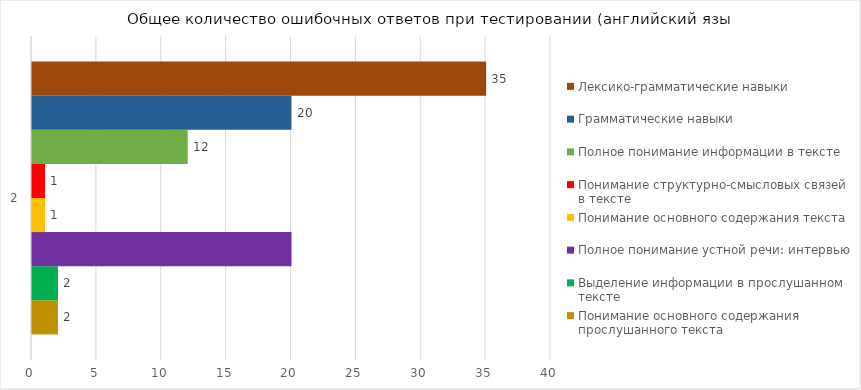
| Category | Понимание основного содержания прослушанного текста | Выделение информации в прослушанном тексте  | Полное понимание устной речи: интервью  | Понимание основного содержания текста  | Понимание структурно-смысловых связей в тексте | Полное понимание информации в тексте | Грамматические навыки | Лексико-грамматические навыки |
|---|---|---|---|---|---|---|---|---|
| 2.0 | 2 | 2 | 20 | 1 | 1 | 12 | 20 | 35 |